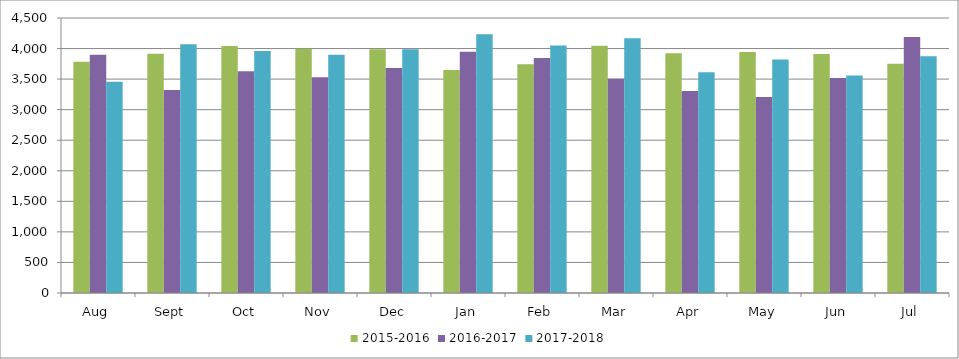
| Category | 2015-2016 | 2016-2017 | 2017-2018 |
|---|---|---|---|
| Aug | 3785 | 3897 | 3455 |
| Sept | 3917 | 3320 | 4071 |
| Oct | 4040 | 3627 | 3960 |
| Nov | 3996 | 3529 | 3900 |
| Dec | 3987 | 3682 | 3988 |
| Jan | 3651 | 3946 | 4234 |
| Feb | 3742 | 3846 | 4048 |
| Mar | 4047 | 3504 | 4167 |
| Apr | 3924 | 3306 | 3611 |
| May | 3943 | 3208 | 3819 |
| Jun | 3912 | 3519 | 3561 |
| Jul | 3753 | 4191 | 3875 |